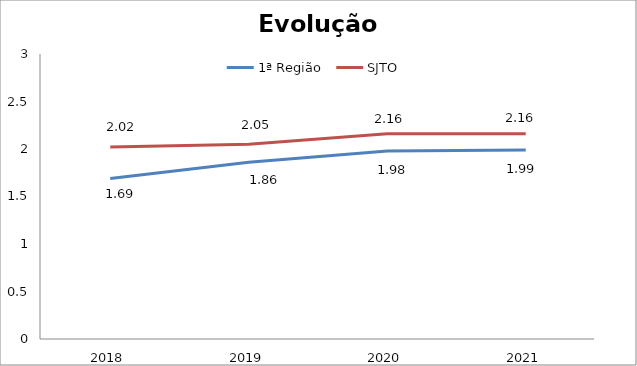
| Category | 1ª Região | SJTO |
|---|---|---|
| 0 | 1.69 | 2.02 |
| 1 | 1.86 | 2.05 |
| 2 | 1.98 | 2.16 |
| 3 | 1.99 | 2.16 |